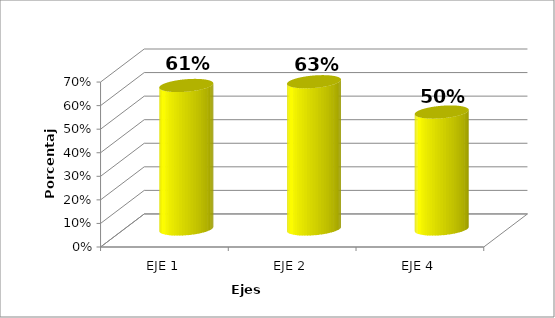
| Category | Series 0 |
|---|---|
| EJE 1 | 0.609 |
| EJE 2 | 0.625 |
| EJE 4 | 0.496 |